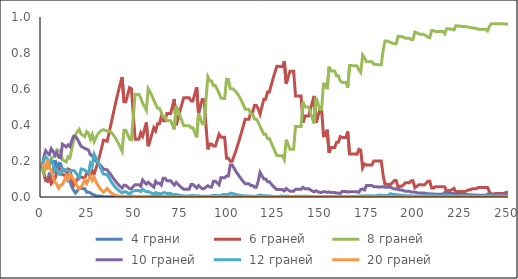
| Category |  4 грани |  6 граней |  8 граней |  10 граней |  12 граней |  20 граней |
|---|---|---|---|---|---|---|
| 0.0 | 0.167 | 0.167 | 0.167 | 0.167 | 0.167 | 0.167 |
| 1.0 | 0.132 | 0.132 | 0.132 | 0.221 | 0.206 | 0.176 |
| 2.0 | 0.093 | 0.093 | 0.17 | 0.257 | 0.224 | 0.164 |
| 3.0 | 0.088 | 0.088 | 0.161 | 0.244 | 0.212 | 0.208 |
| 4.0 | 0.135 | 0.107 | 0.171 | 0.235 | 0.191 | 0.16 |
| 5.0 | 0.093 | 0.073 | 0.215 | 0.269 | 0.204 | 0.147 |
| 6.0 | 0.141 | 0.088 | 0.224 | 0.255 | 0.181 | 0.111 |
| 7.0 | 0.206 | 0.102 | 0.225 | 0.233 | 0.154 | 0.081 |
| 8.0 | 0.131 | 0.137 | 0.263 | 0.247 | 0.152 | 0.069 |
| 9.0 | 0.188 | 0.156 | 0.259 | 0.221 | 0.127 | 0.049 |
| 10.0 | 0.185 | 0.153 | 0.254 | 0.218 | 0.125 | 0.065 |
| 11.0 | 0.149 | 0.124 | 0.206 | 0.293 | 0.158 | 0.07 |
| 12.0 | 0.146 | 0.121 | 0.201 | 0.287 | 0.154 | 0.091 |
| 13.0 | 0.142 | 0.118 | 0.195 | 0.278 | 0.149 | 0.118 |
| 14.0 | 0.089 | 0.155 | 0.223 | 0.29 | 0.145 | 0.098 |
| 15.0 | 0.086 | 0.15 | 0.216 | 0.28 | 0.141 | 0.127 |
| 16.0 | 0.058 | 0.101 | 0.267 | 0.314 | 0.147 | 0.114 |
| 17.0 | 0.037 | 0.065 | 0.315 | 0.337 | 0.147 | 0.098 |
| 18.0 | 0.022 | 0.082 | 0.345 | 0.336 | 0.137 | 0.078 |
| 19.0 | 0.034 | 0.099 | 0.363 | 0.321 | 0.122 | 0.06 |
| 20.0 | 0.051 | 0.118 | 0.376 | 0.302 | 0.107 | 0.045 |
| 21.0 | 0.048 | 0.11 | 0.35 | 0.281 | 0.156 | 0.056 |
| 22.0 | 0.047 | 0.108 | 0.343 | 0.276 | 0.153 | 0.073 |
| 23.0 | 0.046 | 0.106 | 0.335 | 0.27 | 0.149 | 0.095 |
| 24.0 | 0.027 | 0.132 | 0.363 | 0.266 | 0.137 | 0.075 |
| 25.0 | 0.026 | 0.129 | 0.355 | 0.259 | 0.134 | 0.097 |
| 26.0 | 0.024 | 0.116 | 0.32 | 0.234 | 0.188 | 0.117 |
| 27.0 | 0.014 | 0.145 | 0.346 | 0.23 | 0.172 | 0.092 |
| 28.0 | 0.012 | 0.128 | 0.307 | 0.204 | 0.238 | 0.109 |
| 29.0 | 0.007 | 0.159 | 0.331 | 0.2 | 0.217 | 0.085 |
| 30.0 | 0.004 | 0.194 | 0.35 | 0.192 | 0.195 | 0.066 |
| 31.0 | 0.006 | 0.231 | 0.362 | 0.181 | 0.171 | 0.049 |
| 32.0 | 0.004 | 0.272 | 0.37 | 0.168 | 0.149 | 0.037 |
| 33.0 | 0.002 | 0.316 | 0.374 | 0.154 | 0.127 | 0.027 |
| 34.0 | 0.002 | 0.313 | 0.37 | 0.153 | 0.126 | 0.036 |
| 35.0 | 0.002 | 0.31 | 0.366 | 0.151 | 0.125 | 0.047 |
| 36.0 | 0.001 | 0.356 | 0.366 | 0.137 | 0.106 | 0.034 |
| 37.0 | 0.001 | 0.403 | 0.36 | 0.123 | 0.088 | 0.024 |
| 38.0 | 0.002 | 0.451 | 0.349 | 0.108 | 0.073 | 0.017 |
| 39.0 | 0.001 | 0.498 | 0.335 | 0.094 | 0.059 | 0.012 |
| 40.0 | 0.002 | 0.544 | 0.317 | 0.081 | 0.048 | 0.008 |
| 41.0 | 0.002 | 0.587 | 0.298 | 0.069 | 0.038 | 0.006 |
| 42.0 | 0.003 | 0.628 | 0.277 | 0.059 | 0.03 | 0.004 |
| 43.0 | 0.004 | 0.666 | 0.255 | 0.049 | 0.023 | 0.003 |
| 44.0 | 0.003 | 0.529 | 0.371 | 0.065 | 0.029 | 0.003 |
| 45.0 | 0.003 | 0.529 | 0.371 | 0.065 | 0.029 | 0.004 |
| 46.0 | 0.004 | 0.569 | 0.346 | 0.055 | 0.023 | 0.002 |
| 47.0 | 0.005 | 0.607 | 0.321 | 0.046 | 0.018 | 0.002 |
| 48.0 | 0.005 | 0.601 | 0.318 | 0.046 | 0.028 | 0.002 |
| 49.0 | 0.004 | 0.458 | 0.444 | 0.058 | 0.033 | 0.002 |
| 50.0 | 0.003 | 0.321 | 0.57 | 0.068 | 0.036 | 0.002 |
| 51.0 | 0.003 | 0.321 | 0.57 | 0.068 | 0.036 | 0.003 |
| 52.0 | 0.003 | 0.32 | 0.569 | 0.068 | 0.036 | 0.004 |
| 53.0 | 0.002 | 0.357 | 0.55 | 0.06 | 0.029 | 0.003 |
| 54.0 | 0.001 | 0.337 | 0.521 | 0.094 | 0.043 | 0.003 |
| 55.0 | 0.002 | 0.375 | 0.503 | 0.083 | 0.035 | 0.002 |
| 56.0 | 0.003 | 0.414 | 0.481 | 0.072 | 0.029 | 0.002 |
| 57.0 | 0.002 | 0.282 | 0.602 | 0.082 | 0.03 | 0.001 |
| 58.0 | 0.003 | 0.315 | 0.584 | 0.072 | 0.025 | 0.001 |
| 59.0 | 0.004 | 0.349 | 0.562 | 0.063 | 0.02 | 0.001 |
| 60.0 | 0.005 | 0.385 | 0.538 | 0.055 | 0.017 | 0 |
| 61.0 | 0.005 | 0.368 | 0.514 | 0.088 | 0.025 | 0.001 |
| 62.0 | 0.003 | 0.407 | 0.494 | 0.076 | 0.02 | 0 |
| 63.0 | 0.003 | 0.407 | 0.494 | 0.076 | 0.02 | 0.001 |
| 64.0 | 0.001 | 0.446 | 0.47 | 0.066 | 0.016 | 0 |
| 65.0 | 0.001 | 0.423 | 0.446 | 0.105 | 0.024 | 0.001 |
| 66.0 | 0.001 | 0.423 | 0.446 | 0.105 | 0.024 | 0.001 |
| 67.0 | 0.002 | 0.464 | 0.424 | 0.091 | 0.019 | 0 |
| 68.0 | 0.002 | 0.464 | 0.424 | 0.091 | 0.019 | 0.001 |
| 69.0 | 0.002 | 0.463 | 0.424 | 0.091 | 0.019 | 0.001 |
| 70.0 | 0.002 | 0.504 | 0.4 | 0.078 | 0.015 | 0.001 |
| 71.0 | 0.001 | 0.544 | 0.376 | 0.066 | 0.012 | 0 |
| 72.0 | 0.001 | 0.399 | 0.505 | 0.081 | 0.014 | 0 |
| 73.0 | 0.001 | 0.437 | 0.48 | 0.07 | 0.011 | 0 |
| 74.0 | 0.002 | 0.475 | 0.454 | 0.06 | 0.009 | 0 |
| 75.0 | 0.002 | 0.513 | 0.426 | 0.051 | 0.007 | 0 |
| 76.0 | 0.003 | 0.551 | 0.397 | 0.043 | 0.006 | 0 |
| 77.0 | 0.003 | 0.551 | 0.397 | 0.043 | 0.006 | 0 |
| 78.0 | 0.003 | 0.551 | 0.396 | 0.043 | 0.006 | 0 |
| 79.0 | 0.003 | 0.551 | 0.396 | 0.043 | 0.006 | 0 |
| 80.0 | 0.003 | 0.534 | 0.384 | 0.07 | 0.009 | 0 |
| 81.0 | 0.003 | 0.534 | 0.384 | 0.07 | 0.009 | 0 |
| 82.0 | 0.002 | 0.573 | 0.358 | 0.059 | 0.007 | 0 |
| 83.0 | 0.002 | 0.611 | 0.332 | 0.05 | 0.005 | 0 |
| 84.0 | 0.002 | 0.465 | 0.463 | 0.064 | 0.006 | 0 |
| 85.0 | 0.001 | 0.504 | 0.436 | 0.054 | 0.005 | 0 |
| 86.0 | 0.001 | 0.542 | 0.407 | 0.046 | 0.004 | 0 |
| 87.0 | 0.001 | 0.542 | 0.407 | 0.046 | 0.004 | 0 |
| 88.0 | 0.001 | 0.395 | 0.543 | 0.056 | 0.005 | 0 |
| 89.0 | 0.001 | 0.265 | 0.667 | 0.063 | 0.005 | 0 |
| 90.0 | 0.001 | 0.295 | 0.646 | 0.055 | 0.004 | 0 |
| 91.0 | 0.001 | 0.294 | 0.644 | 0.055 | 0.006 | 0 |
| 92.0 | 0.001 | 0.283 | 0.619 | 0.088 | 0.009 | 0 |
| 93.0 | 0.001 | 0.283 | 0.619 | 0.088 | 0.009 | 0 |
| 94.0 | 0.001 | 0.315 | 0.599 | 0.077 | 0.007 | 0 |
| 95.0 | 0.001 | 0.349 | 0.577 | 0.068 | 0.006 | 0 |
| 96.0 | 0.001 | 0.333 | 0.55 | 0.108 | 0.009 | 0 |
| 97.0 | 0.001 | 0.331 | 0.547 | 0.107 | 0.014 | 0 |
| 98.0 | 0.001 | 0.331 | 0.547 | 0.107 | 0.014 | 0 |
| 99.0 | 0 | 0.216 | 0.653 | 0.116 | 0.014 | 0 |
| 100.0 | 0 | 0.216 | 0.653 | 0.116 | 0.014 | 0 |
| 101.0 | 0 | 0.199 | 0.602 | 0.178 | 0.02 | 0 |
| 102.0 | 0 | 0.199 | 0.602 | 0.178 | 0.02 | 0 |
| 103.0 | 0 | 0.227 | 0.596 | 0.16 | 0.017 | 0 |
| 104.0 | 0 | 0.256 | 0.586 | 0.143 | 0.014 | 0 |
| 105.0 | 0 | 0.288 | 0.572 | 0.127 | 0.012 | 0 |
| 106.0 | 0 | 0.322 | 0.555 | 0.112 | 0.01 | 0 |
| 107.0 | 0 | 0.358 | 0.535 | 0.099 | 0.008 | 0 |
| 108.0 | 0 | 0.395 | 0.513 | 0.086 | 0.006 | 0 |
| 109.0 | 0 | 0.433 | 0.488 | 0.074 | 0.005 | 0 |
| 110.0 | 0 | 0.433 | 0.488 | 0.074 | 0.005 | 0 |
| 111.0 | 0 | 0.433 | 0.488 | 0.074 | 0.005 | 0 |
| 112.0 | 0 | 0.471 | 0.461 | 0.064 | 0.004 | 0 |
| 113.0 | 0 | 0.471 | 0.461 | 0.064 | 0.004 | 0 |
| 114.0 | 0 | 0.509 | 0.433 | 0.054 | 0.003 | 0 |
| 115.0 | 0 | 0.508 | 0.432 | 0.054 | 0.005 | 0 |
| 116.0 | 0 | 0.489 | 0.416 | 0.087 | 0.008 | 0 |
| 117.0 | 0 | 0.46 | 0.392 | 0.137 | 0.011 | 0 |
| 118.0 | 0 | 0.502 | 0.371 | 0.118 | 0.009 | 0 |
| 119.0 | 0 | 0.543 | 0.349 | 0.101 | 0.007 | 0 |
| 120.0 | 0 | 0.543 | 0.349 | 0.101 | 0.007 | 0 |
| 121.0 | 0 | 0.584 | 0.325 | 0.085 | 0.006 | 0 |
| 122.0 | 0 | 0.584 | 0.325 | 0.085 | 0.006 | 0 |
| 123.0 | 0 | 0.622 | 0.301 | 0.072 | 0.004 | 0 |
| 124.0 | 0 | 0.659 | 0.277 | 0.06 | 0.004 | 0 |
| 125.0 | 0 | 0.694 | 0.253 | 0.05 | 0.003 | 0 |
| 126.0 | 0 | 0.726 | 0.23 | 0.041 | 0.002 | 0 |
| 127.0 | 0 | 0.726 | 0.23 | 0.041 | 0.003 | 0 |
| 128.0 | 0 | 0.724 | 0.23 | 0.041 | 0.005 | 0 |
| 129.0 | 0 | 0.724 | 0.229 | 0.041 | 0.005 | 0 |
| 130.0 | 0 | 0.755 | 0.208 | 0.034 | 0.004 | 0 |
| 131.0 | 0 | 0.63 | 0.318 | 0.047 | 0.005 | 0 |
| 132.0 | 0 | 0.665 | 0.291 | 0.039 | 0.004 | 0 |
| 133.0 | 0 | 0.699 | 0.266 | 0.033 | 0.003 | 0 |
| 134.0 | 0 | 0.699 | 0.266 | 0.033 | 0.003 | 0 |
| 135.0 | 0 | 0.699 | 0.266 | 0.033 | 0.003 | 0 |
| 136.0 | 0 | 0.561 | 0.391 | 0.044 | 0.004 | 0 |
| 137.0 | 0 | 0.561 | 0.391 | 0.044 | 0.004 | 0 |
| 138.0 | 0 | 0.561 | 0.391 | 0.044 | 0.004 | 0 |
| 139.0 | 0 | 0.561 | 0.391 | 0.044 | 0.004 | 0 |
| 140.0 | 0 | 0.413 | 0.529 | 0.053 | 0.004 | 0 |
| 141.0 | 0 | 0.45 | 0.5 | 0.046 | 0.003 | 0 |
| 142.0 | 0 | 0.45 | 0.5 | 0.046 | 0.003 | 0 |
| 143.0 | 0 | 0.45 | 0.5 | 0.046 | 0.003 | 0 |
| 144.0 | 0 | 0.488 | 0.47 | 0.039 | 0.003 | 0 |
| 145.0 | 0 | 0.525 | 0.44 | 0.033 | 0.002 | 0 |
| 146.0 | 0 | 0.562 | 0.408 | 0.028 | 0.002 | 0 |
| 147.0 | 0 | 0.413 | 0.551 | 0.035 | 0.002 | 0 |
| 148.0 | 0 | 0.449 | 0.52 | 0.03 | 0.002 | 0 |
| 149.0 | 0 | 0.485 | 0.488 | 0.025 | 0.001 | 0 |
| 150.0 | 0 | 0.485 | 0.488 | 0.025 | 0.001 | 0 |
| 151.0 | 0 | 0.341 | 0.628 | 0.03 | 0.001 | 0 |
| 152.0 | 0 | 0.341 | 0.628 | 0.03 | 0.001 | 0 |
| 153.0 | 0 | 0.374 | 0.599 | 0.026 | 0.001 | 0 |
| 154.0 | 0 | 0.247 | 0.724 | 0.028 | 0.001 | 0 |
| 155.0 | 0 | 0.275 | 0.7 | 0.025 | 0.001 | 0 |
| 156.0 | 0 | 0.275 | 0.7 | 0.025 | 0.001 | 0 |
| 157.0 | 0 | 0.275 | 0.7 | 0.025 | 0.001 | 0 |
| 158.0 | 0 | 0.304 | 0.673 | 0.022 | 0.001 | 0 |
| 159.0 | 0 | 0.304 | 0.673 | 0.022 | 0.001 | 0 |
| 160.0 | 0 | 0.335 | 0.645 | 0.019 | 0.001 | 0 |
| 161.0 | 0 | 0.331 | 0.636 | 0.031 | 0.001 | 0 |
| 162.0 | 0 | 0.331 | 0.636 | 0.031 | 0.001 | 0 |
| 163.0 | 0 | 0.331 | 0.636 | 0.031 | 0.001 | 0 |
| 164.0 | 0 | 0.364 | 0.608 | 0.027 | 0.001 | 0 |
| 165.0 | 0 | 0.239 | 0.731 | 0.029 | 0.001 | 0 |
| 166.0 | 0 | 0.239 | 0.73 | 0.029 | 0.002 | 0 |
| 167.0 | 0 | 0.238 | 0.729 | 0.029 | 0.003 | 0 |
| 168.0 | 0 | 0.238 | 0.729 | 0.029 | 0.003 | 0 |
| 169.0 | 0 | 0.238 | 0.728 | 0.029 | 0.005 | 0 |
| 170.0 | 0 | 0.265 | 0.705 | 0.026 | 0.004 | 0 |
| 171.0 | 0 | 0.26 | 0.692 | 0.042 | 0.006 | 0 |
| 172.0 | 0 | 0.162 | 0.789 | 0.044 | 0.006 | 0 |
| 173.0 | 0 | 0.183 | 0.773 | 0.039 | 0.005 | 0 |
| 174.0 | 0 | 0.178 | 0.752 | 0.063 | 0.007 | 0 |
| 175.0 | 0 | 0.178 | 0.752 | 0.063 | 0.007 | 0 |
| 176.0 | 0 | 0.178 | 0.752 | 0.063 | 0.007 | 0 |
| 177.0 | 0 | 0.178 | 0.752 | 0.063 | 0.007 | 0 |
| 178.0 | 0 | 0.201 | 0.737 | 0.056 | 0.006 | 0 |
| 179.0 | 0 | 0.201 | 0.737 | 0.056 | 0.006 | 0 |
| 180.0 | 0 | 0.2 | 0.735 | 0.056 | 0.009 | 0 |
| 181.0 | 0 | 0.2 | 0.735 | 0.056 | 0.009 | 0 |
| 182.0 | 0 | 0.2 | 0.735 | 0.056 | 0.009 | 0 |
| 183.0 | 0 | 0.121 | 0.814 | 0.057 | 0.009 | 0 |
| 184.0 | 0 | 0.07 | 0.867 | 0.055 | 0.008 | 0 |
| 185.0 | 0 | 0.07 | 0.867 | 0.055 | 0.008 | 0 |
| 186.0 | 0 | 0.07 | 0.863 | 0.055 | 0.012 | 0 |
| 187.0 | 0 | 0.069 | 0.858 | 0.054 | 0.019 | 0 |
| 188.0 | 0 | 0.08 | 0.855 | 0.049 | 0.016 | 0 |
| 189.0 | 0 | 0.091 | 0.851 | 0.044 | 0.013 | 0 |
| 190.0 | 0 | 0.091 | 0.851 | 0.044 | 0.013 | 0 |
| 191.0 | 0 | 0.052 | 0.893 | 0.042 | 0.012 | 0 |
| 192.0 | 0 | 0.06 | 0.891 | 0.039 | 0.01 | 0 |
| 193.0 | 0 | 0.06 | 0.891 | 0.039 | 0.01 | 0 |
| 194.0 | 0 | 0.069 | 0.888 | 0.035 | 0.008 | 0 |
| 195.0 | 0 | 0.079 | 0.882 | 0.032 | 0.007 | 0 |
| 196.0 | 0 | 0.079 | 0.882 | 0.032 | 0.007 | 0 |
| 197.0 | 0 | 0.079 | 0.882 | 0.032 | 0.007 | 0 |
| 198.0 | 0 | 0.09 | 0.875 | 0.028 | 0.006 | 0 |
| 199.0 | 0 | 0.09 | 0.875 | 0.028 | 0.006 | 0 |
| 200.0 | 0 | 0.051 | 0.916 | 0.027 | 0.005 | 0 |
| 201.0 | 0 | 0.059 | 0.912 | 0.024 | 0.005 | 0 |
| 202.0 | 0 | 0.068 | 0.907 | 0.022 | 0.004 | 0 |
| 203.0 | 0 | 0.067 | 0.905 | 0.022 | 0.006 | 0 |
| 204.0 | 0 | 0.067 | 0.905 | 0.022 | 0.006 | 0 |
| 205.0 | 0 | 0.067 | 0.902 | 0.022 | 0.009 | 0 |
| 206.0 | 0 | 0.077 | 0.896 | 0.02 | 0.008 | 0 |
| 207.0 | 0 | 0.088 | 0.888 | 0.018 | 0.006 | 0 |
| 208.0 | 0 | 0.087 | 0.885 | 0.018 | 0.01 | 0 |
| 209.0 | 0 | 0.05 | 0.924 | 0.017 | 0.009 | 0 |
| 210.0 | 0 | 0.05 | 0.924 | 0.017 | 0.009 | 0 |
| 211.0 | 0 | 0.057 | 0.92 | 0.015 | 0.008 | 0 |
| 212.0 | 0 | 0.057 | 0.92 | 0.015 | 0.008 | 0 |
| 213.0 | 0 | 0.057 | 0.92 | 0.015 | 0.008 | 0 |
| 214.0 | 0 | 0.057 | 0.92 | 0.015 | 0.008 | 0 |
| 215.0 | 0 | 0.057 | 0.92 | 0.015 | 0.008 | 0 |
| 216.0 | 0 | 0.056 | 0.907 | 0.025 | 0.012 | 0 |
| 217.0 | 0 | 0.032 | 0.935 | 0.024 | 0.01 | 0 |
| 218.0 | 0 | 0.036 | 0.934 | 0.021 | 0.009 | 0 |
| 219.0 | 0 | 0.036 | 0.934 | 0.021 | 0.009 | 0 |
| 220.0 | 0 | 0.042 | 0.932 | 0.019 | 0.007 | 0 |
| 221.0 | 0 | 0.048 | 0.928 | 0.018 | 0.006 | 0 |
| 222.0 | 0 | 0.027 | 0.951 | 0.016 | 0.005 | 0 |
| 223.0 | 0 | 0.031 | 0.95 | 0.015 | 0.005 | 0 |
| 224.0 | 0 | 0.031 | 0.95 | 0.015 | 0.005 | 0 |
| 225.0 | 0 | 0.031 | 0.947 | 0.015 | 0.007 | 0 |
| 226.0 | 0 | 0.031 | 0.947 | 0.015 | 0.007 | 0 |
| 227.0 | 0 | 0.031 | 0.947 | 0.015 | 0.007 | 0 |
| 228.0 | 0 | 0.035 | 0.945 | 0.013 | 0.006 | 0 |
| 229.0 | 0 | 0.041 | 0.942 | 0.012 | 0.005 | 0 |
| 230.0 | 0 | 0.041 | 0.942 | 0.012 | 0.005 | 0 |
| 231.0 | 0 | 0.046 | 0.938 | 0.011 | 0.004 | 0 |
| 232.0 | 0 | 0.046 | 0.938 | 0.011 | 0.004 | 0 |
| 233.0 | 0 | 0.046 | 0.936 | 0.011 | 0.007 | 0 |
| 234.0 | 0 | 0.053 | 0.931 | 0.01 | 0.006 | 0 |
| 235.0 | 0 | 0.053 | 0.931 | 0.01 | 0.006 | 0 |
| 236.0 | 0 | 0.053 | 0.931 | 0.01 | 0.006 | 0 |
| 237.0 | 0 | 0.053 | 0.931 | 0.01 | 0.006 | 0 |
| 238.0 | 0 | 0.053 | 0.931 | 0.01 | 0.006 | 0 |
| 239.0 | 0 | 0.053 | 0.922 | 0.016 | 0.009 | 0 |
| 240.0 | 0 | 0.029 | 0.948 | 0.015 | 0.007 | 0 |
| 241.0 | 0 | 0.016 | 0.963 | 0.014 | 0.006 | 0 |
| 242.0 | 0 | 0.016 | 0.963 | 0.014 | 0.006 | 0 |
| 243.0 | 0 | 0.019 | 0.963 | 0.013 | 0.005 | 0 |
| 244.0 | 0 | 0.019 | 0.963 | 0.013 | 0.005 | 0 |
| 245.0 | 0 | 0.019 | 0.963 | 0.013 | 0.005 | 0 |
| 246.0 | 0 | 0.019 | 0.963 | 0.013 | 0.005 | 0 |
| 247.0 | 0 | 0.019 | 0.963 | 0.013 | 0.005 | 0 |
| 248.0 | 0 | 0.022 | 0.962 | 0.012 | 0.005 | 0 |
| 249.0 | 0 | 0.025 | 0.96 | 0.011 | 0.004 | 0 |
| 250.0 | 0 | 0.029 | 0.958 | 0.01 | 0.003 | 0 |